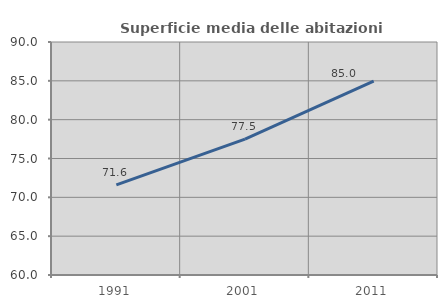
| Category | Superficie media delle abitazioni occupate |
|---|---|
| 1991.0 | 71.605 |
| 2001.0 | 77.486 |
| 2011.0 | 84.95 |